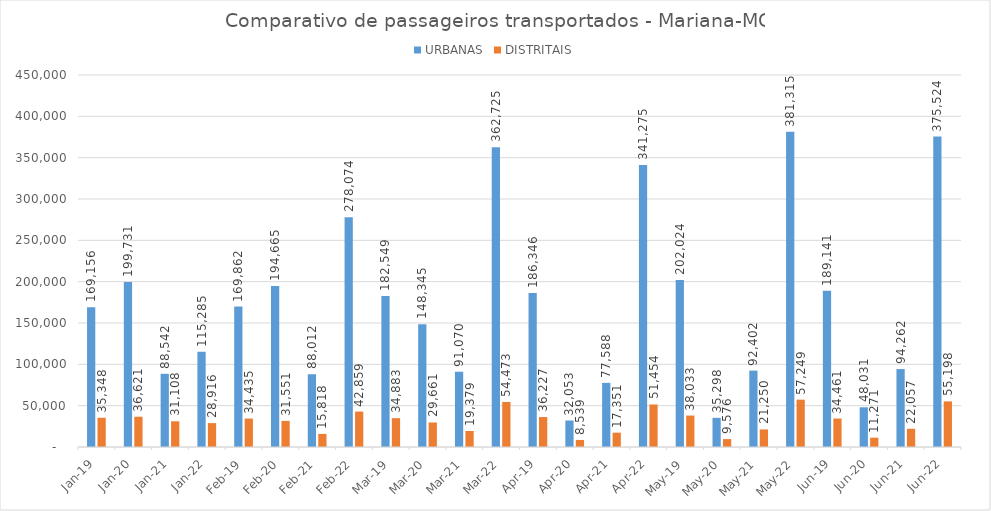
| Category | URBANAS | DISTRITAIS |
|---|---|---|
| 2019-01-01 | 169155.84 | 35347.73 |
| 2020-01-01 | 199731 | 36620.65 |
| 2021-01-01 | 88542 | 31107.89 |
| 2022-01-01 | 115285 | 28916 |
| 2019-02-01 | 169862 | 34435 |
| 2020-02-01 | 194665 | 31551 |
| 2021-02-01 | 88012 | 15818 |
| 2022-02-01 | 278074 | 42859 |
| 2019-03-01 | 182549.07 | 34883.09 |
| 2020-03-01 | 148345 | 29661 |
| 2021-03-01 | 91070 | 19379.36 |
| 2022-03-01 | 362725 | 54473 |
| 2019-04-01 | 186346.05 | 36227.4 |
| 2020-04-01 | 32053 | 8538.97 |
| 2021-04-01 | 77588 | 17351.4 |
| 2022-04-01 | 341275 | 51454 |
| 2019-05-01 | 202024.02 | 38032.72 |
| 2020-05-01 | 35298 | 9575.94 |
| 2021-05-01 | 92402 | 21250.02 |
| 2022-05-01 | 381315 | 57249 |
| 2019-06-01 | 189141.15 | 34460.8 |
| 2020-06-01 | 48031 | 11271.15 |
| 2021-06-01 | 94262 | 22057.09 |
| 2022-06-01 | 375524 | 55198 |